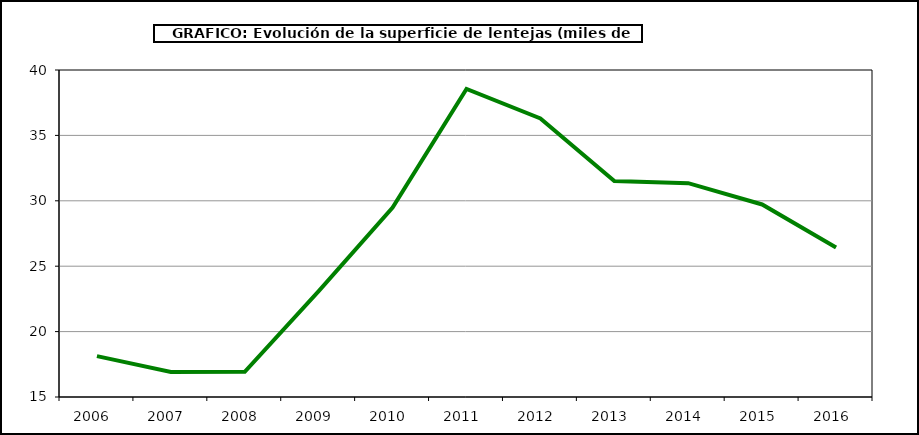
| Category | Superficie |
|---|---|
| 2006.0 | 18.125 |
| 2007.0 | 16.913 |
| 2008.0 | 16.932 |
| 2009.0 | 23.088 |
| 2010.0 | 29.478 |
| 2011.0 | 38.55 |
| 2012.0 | 36.298 |
| 2013.0 | 31.506 |
| 2014.0 | 31.35 |
| 2015.0 | 29.72 |
| 2016.0 | 26.427 |